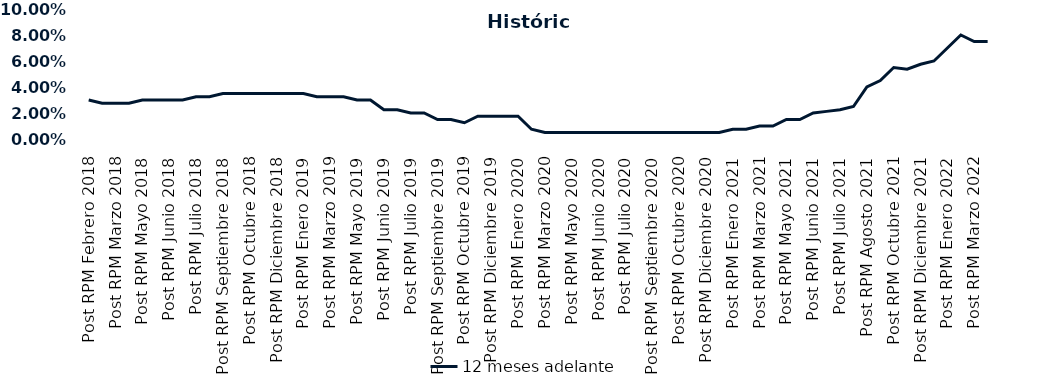
| Category | 12 meses adelante  |
|---|---|
| Post RPM Febrero 2018 | 0.03 |
| Pre RPM Marzo 2018 | 0.028 |
| Post RPM Marzo 2018 | 0.028 |
| Pre RPM Mayo 2018 | 0.028 |
| Post RPM Mayo 2018 | 0.03 |
| Pre RPM Junio 2018 | 0.03 |
| Post RPM Junio 2018 | 0.03 |
| Pre RPM Julio 2018 | 0.03 |
| Post RPM Julio 2018 | 0.032 |
| Pre RPM Septiembre 2018 | 0.032 |
| Post RPM Septiembre 2018 | 0.035 |
| Pre RPM Octubre 2018 | 0.035 |
| Post RPM Octubre 2018 | 0.035 |
| Pre RPM Diciembre 2018 | 0.035 |
| Post RPM Diciembre 2018 | 0.035 |
| Pre RPM Enero 2019 | 0.035 |
| Post RPM Enero 2019 | 0.035 |
| Pre RPM Marzo 2019 | 0.032 |
| Post RPM Marzo 2019 | 0.032 |
| Pre RPM Mayo 2019 | 0.032 |
| Post RPM Mayo 2019 | 0.03 |
| Pre RPM Junio 2019 | 0.03 |
| Post RPM Junio 2019 | 0.022 |
| Pre RPM Julio 2019 | 0.022 |
| Post RPM Julio 2019 | 0.02 |
| Pre RPM Septiembre 2019 | 0.02 |
| Post RPM Septiembre 2019 | 0.015 |
| Pre RPM Octubre 2019 | 0.015 |
| Post RPM Octubre 2019 | 0.012 |
| Pre RPM Diciembre 2019 | 0.018 |
| Post RPM Diciembre 2019 | 0.018 |
| Pre RPM Enero 2020 | 0.018 |
| Post RPM Enero 2020 | 0.018 |
| Pre RPM Marzo 2020 | 0.008 |
| Post RPM Marzo 2020 | 0.005 |
| Pre RPM Mayo 2020 | 0.005 |
| Post RPM Mayo 2020 | 0.005 |
| Pre RPM Junio 2020 | 0.005 |
| Post RPM Junio 2020 | 0.005 |
| Pre RPM Julio 2020 | 0.005 |
| Post RPM Julio 2020 | 0.005 |
| Pre RPM Septiembre 2020 | 0.005 |
| Post RPM Septiembre 2020 | 0.005 |
| Pre RPM Octubre 2020 | 0.005 |
| Post RPM Octubre 2020 | 0.005 |
| Pre RPM Diciembre 2020 | 0.005 |
| Post RPM Diciembre 2020 | 0.005 |
| Pre RPM Enero 2021 | 0.005 |
| Post RPM Enero 2021 | 0.008 |
| Pre RPM Marzo 2021 | 0.008 |
| Post RPM Marzo 2021 | 0.01 |
| Pre RPM Mayo 2021 | 0.01 |
| Post RPM Mayo 2021 | 0.015 |
| Pre RPM Junio 2021 | 0.015 |
| Post RPM Junio 2021 | 0.02 |
| Pre RPM Julio 2021 | 0.021 |
| Post RPM Julio 2021 | 0.022 |
| Pre RPM Agosto 2021 | 0.025 |
| Post RPM Agosto 2021 | 0.04 |
| Pre RPM Octubre 2021 | 0.045 |
| Post RPM Octubre 2021 | 0.055 |
| Pre RPM Diciembre 2021 | 0.054 |
| Post RPM Diciembre 2021 | 0.058 |
| Pre RPM Enero 2022 | 0.06 |
| Post RPM Enero 2022 | 0.07 |
| Pre RPM Marzo 2022 | 0.08 |
| Post RPM Marzo 2022 | 0.075 |
| Pre RPM Mayo 2022 | 0.075 |